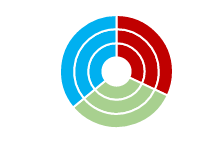
| Category | Sport |
|---|---|
| Frequent | 0.32 |
| Moderate | 0.32 |
| Infrequent | 0.36 |